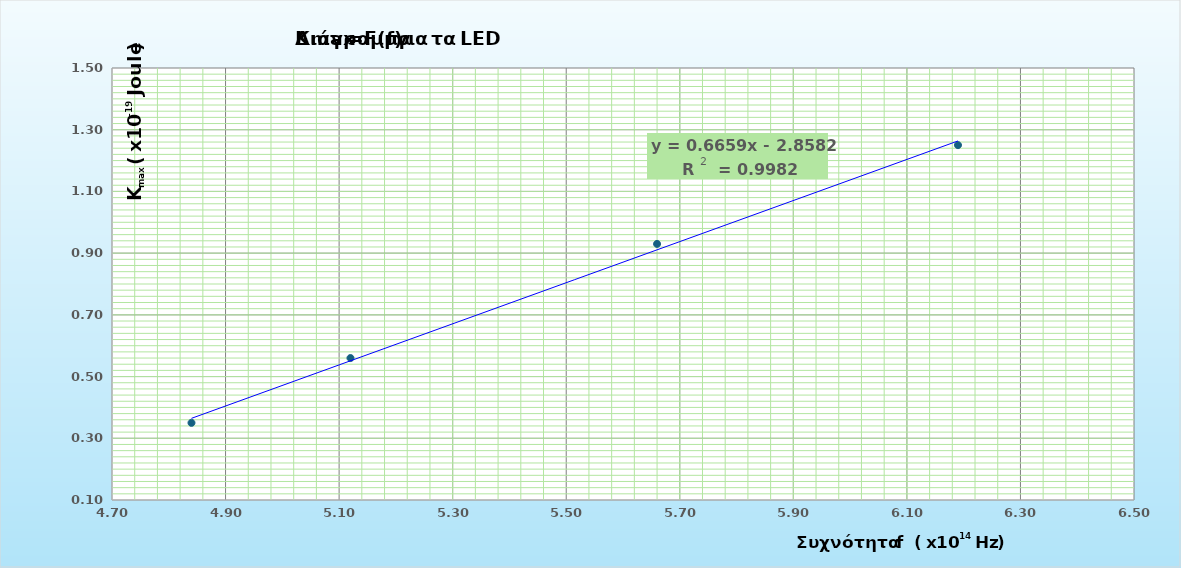
| Category | Kmax (x10^-19 Joule) (Kmax =qe*V) |
|---|---|
| 4.84 | 0.35 |
| 5.12 | 0.56 |
| 5.66 | 0.93 |
| 6.19 | 1.25 |